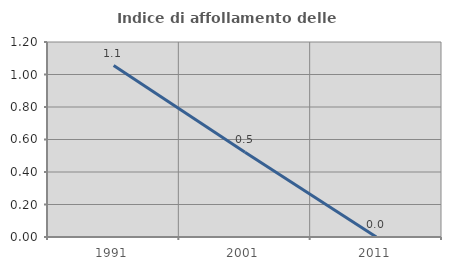
| Category | Indice di affollamento delle abitazioni  |
|---|---|
| 1991.0 | 1.055 |
| 2001.0 | 0.522 |
| 2011.0 | 0 |